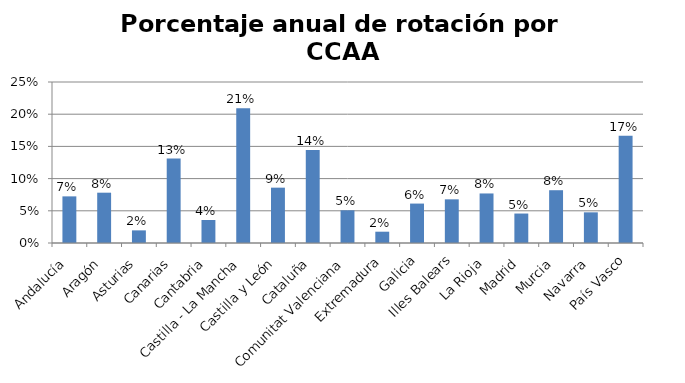
| Category | Porcentaje |
|---|---|
| Andalucía | 0.072 |
| Aragón | 0.078 |
| Asturias | 0.02 |
| Canarias | 0.131 |
| Cantabria | 0.036 |
| Castilla - La Mancha | 0.209 |
| Castilla y León | 0.086 |
| Cataluña | 0.144 |
| Comunitat Valenciana | 0.051 |
| Extremadura | 0.018 |
| Galicia | 0.061 |
| Illes Balears | 0.068 |
| La Rioja | 0.077 |
| Madrid | 0.046 |
| Murcia | 0.082 |
| Navarra | 0.048 |
| País Vasco | 0.167 |